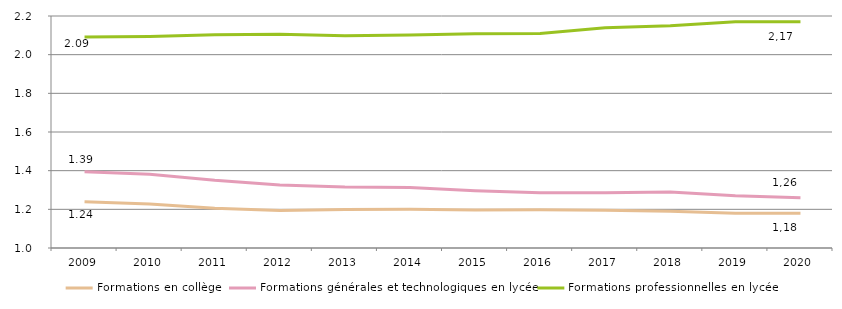
| Category | Formations en collège | Formations générales et technologiques en lycée | Formations professionnelles en lycée |
|---|---|---|---|
| 2009.0 | 1.239 | 1.394 | 2.091 |
| 2010.0 | 1.228 | 1.382 | 2.094 |
| 2011.0 | 1.206 | 1.35 | 2.103 |
| 2012.0 | 1.194 | 1.326 | 2.105 |
| 2013.0 | 1.199 | 1.316 | 2.097 |
| 2014.0 | 1.2 | 1.313 | 2.102 |
| 2015.0 | 1.196 | 1.297 | 2.108 |
| 2016.0 | 1.198 | 1.286 | 2.11 |
| 2017.0 | 1.195 | 1.285 | 2.139 |
| 2018.0 | 1.19 | 1.29 | 2.15 |
| 2019.0 | 1.18 | 1.27 | 2.17 |
| 2020.0 | 1.18 | 1.26 | 2.17 |